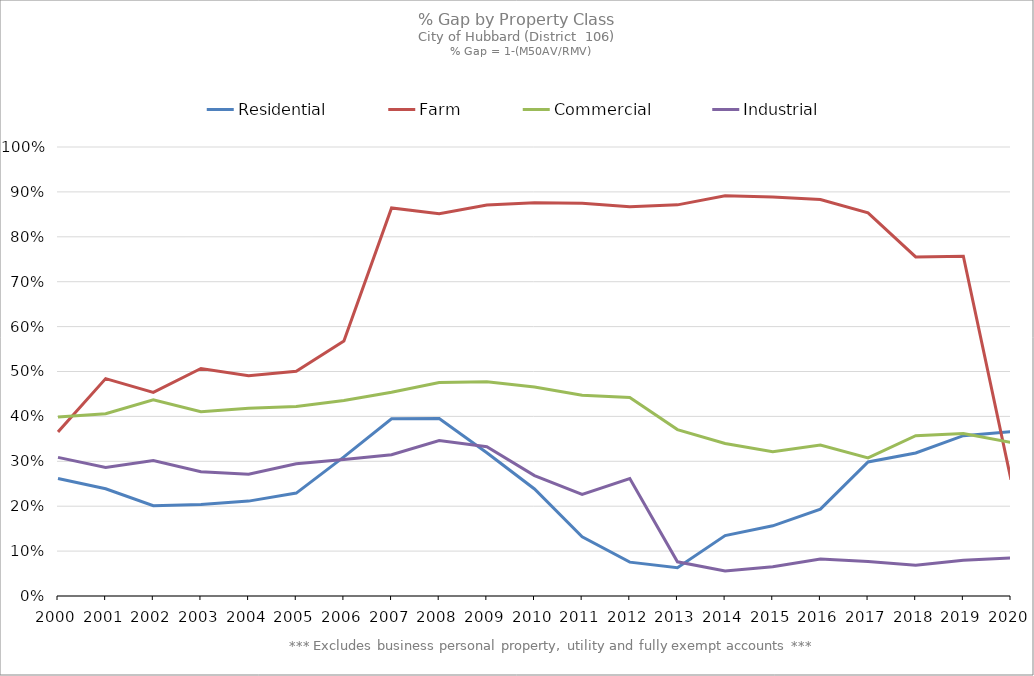
| Category | Residential | Farm | Commercial | Industrial |
|---|---|---|---|---|
| 2000.0 | 0.262 | 0.365 | 0.399 | 0.309 |
| 2001.0 | 0.239 | 0.484 | 0.406 | 0.286 |
| 2002.0 | 0.201 | 0.453 | 0.437 | 0.302 |
| 2003.0 | 0.204 | 0.507 | 0.41 | 0.277 |
| 2004.0 | 0.211 | 0.491 | 0.418 | 0.271 |
| 2005.0 | 0.229 | 0.5 | 0.422 | 0.295 |
| 2006.0 | 0.31 | 0.568 | 0.435 | 0.304 |
| 2007.0 | 0.395 | 0.864 | 0.454 | 0.315 |
| 2008.0 | 0.395 | 0.851 | 0.476 | 0.346 |
| 2009.0 | 0.319 | 0.871 | 0.477 | 0.333 |
| 2010.0 | 0.238 | 0.876 | 0.466 | 0.268 |
| 2011.0 | 0.132 | 0.875 | 0.447 | 0.226 |
| 2012.0 | 0.075 | 0.867 | 0.442 | 0.262 |
| 2013.0 | 0.063 | 0.871 | 0.371 | 0.076 |
| 2014.0 | 0.135 | 0.891 | 0.34 | 0.056 |
| 2015.0 | 0.156 | 0.889 | 0.321 | 0.065 |
| 2016.0 | 0.193 | 0.883 | 0.336 | 0.082 |
| 2017.0 | 0.299 | 0.853 | 0.308 | 0.077 |
| 2018.0 | 0.319 | 0.755 | 0.357 | 0.068 |
| 2019.0 | 0.357 | 0.757 | 0.362 | 0.08 |
| 2020.0 | 0.366 | 0.259 | 0.342 | 0.085 |